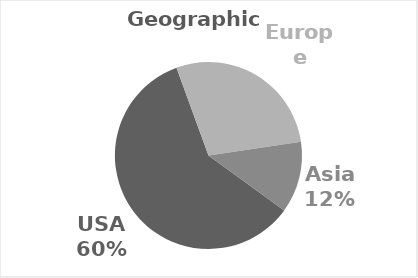
| Category | USA |
|---|---|
| USA | 6350650.73 |
| Europe | 3014631.798 |
| Asia | 1319401.426 |